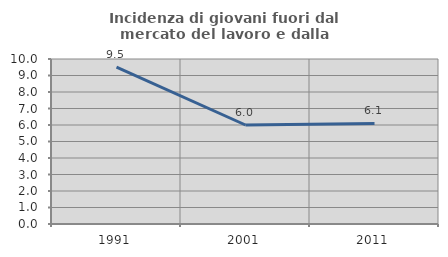
| Category | Incidenza di giovani fuori dal mercato del lavoro e dalla formazione  |
|---|---|
| 1991.0 | 9.508 |
| 2001.0 | 6 |
| 2011.0 | 6.091 |